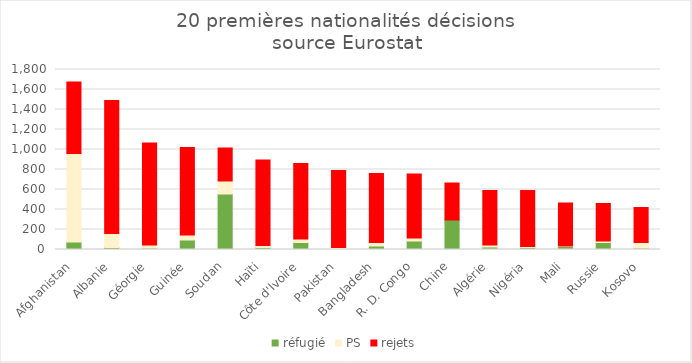
| Category | réfugié | PS | rejets |
|---|---|---|---|
| Afghanistan | 75 | 885 | 715 |
| Albanie | 20 | 140 | 1330 |
| Géorgie | 15 | 30 | 1020 |
| Guinée | 95 | 50 | 875 |
| Soudan | 555 | 130 | 330 |
| Haïti | 20 | 20 | 855 |
| Côte d'Ivoire | 70 | 35 | 755 |
| Pakistan | 10 | 10 | 770 |
| Bangladesh | 35 | 35 | 690 |
| R. D. Congo | 85 | 30 | 640 |
| Chine | 295 | 0 | 370 |
| Algérie | 25 | 20 | 545 |
| Nigéria | 20 | 10 | 560 |
| Mali | 30 | 5 | 430 |
| Russie | 70 | 15 | 375 |
| Kosovo | 15 | 55 | 350 |